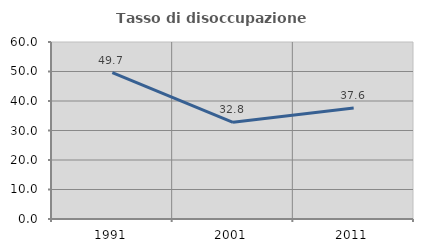
| Category | Tasso di disoccupazione giovanile  |
|---|---|
| 1991.0 | 49.654 |
| 2001.0 | 32.787 |
| 2011.0 | 37.611 |